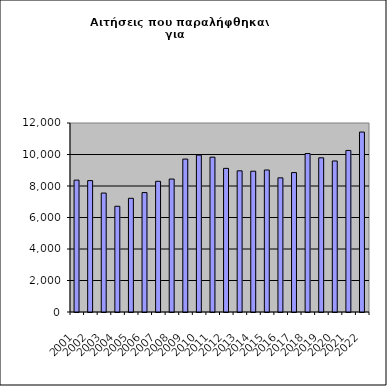
| Category | Series 0 |
|---|---|
| 2001.0 | 8373 |
| 2002.0 | 8343 |
| 2003.0 | 7552 |
| 2004.0 | 6712 |
| 2005.0 | 7219 |
| 2006.0 | 7583 |
| 2007.0 | 8298 |
| 2008.0 | 8442 |
| 2009.0 | 9709 |
| 2010.0 | 9961 |
| 2011.0 | 9830 |
| 2012.0 | 9120 |
| 2013.0 | 8963 |
| 2014.0 | 8939 |
| 2015.0 | 9015 |
| 2016.0 | 8517 |
| 2017.0 | 8853 |
| 2018.0 | 10061 |
| 2019.0 | 9790 |
| 2020.0 | 9589 |
| 2021.0 | 10257 |
| 2022.0 | 11425 |